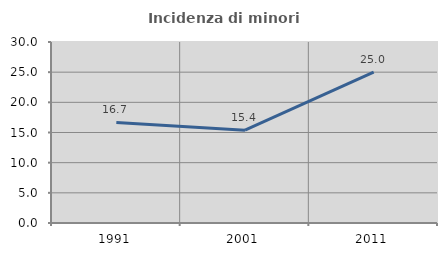
| Category | Incidenza di minori stranieri |
|---|---|
| 1991.0 | 16.667 |
| 2001.0 | 15.385 |
| 2011.0 | 25 |